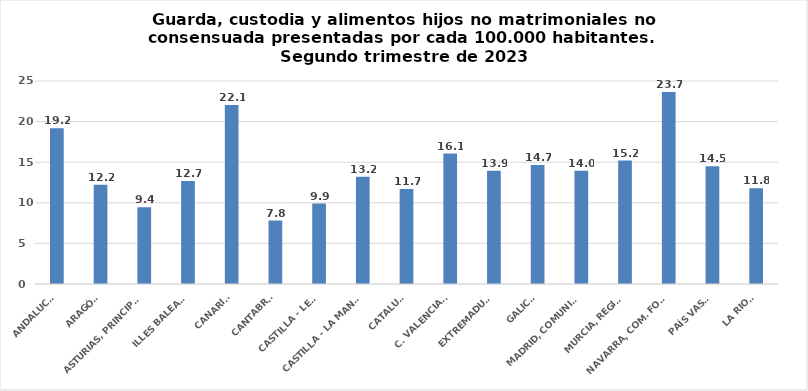
| Category | Series 0 |
|---|---|
| ANDALUCÍA | 19.188 |
| ARAGÓN | 12.228 |
| ASTURIAS, PRINCIPADO | 9.438 |
| ILLES BALEARS | 12.679 |
| CANARIAS | 22.052 |
| CANTABRIA | 7.816 |
| CASTILLA - LEÓN | 9.905 |
| CASTILLA - LA MANCHA | 13.217 |
| CATALUÑA | 11.685 |
| C. VALENCIANA | 16.059 |
| EXTREMADURA | 13.943 |
| GALICIA | 14.668 |
| MADRID, COMUNIDAD | 13.958 |
| MURCIA, REGIÓN | 15.199 |
| NAVARRA, COM. FORAL | 23.654 |
| PAÍS VASCO | 14.505 |
| LA RIOJA | 11.792 |